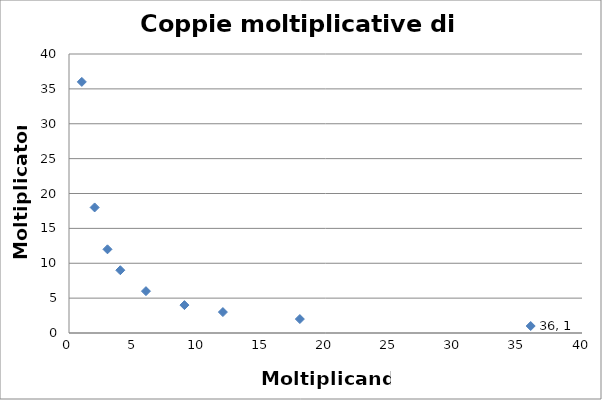
| Category | Moltiplicatore |
|---|---|
| 1.0 | 36 |
| 2.0 | 18 |
| 3.0 | 12 |
| 4.0 | 9 |
| 6.0 | 6 |
| 9.0 | 4 |
| 12.0 | 3 |
| 18.0 | 2 |
| 36.0 | 1 |